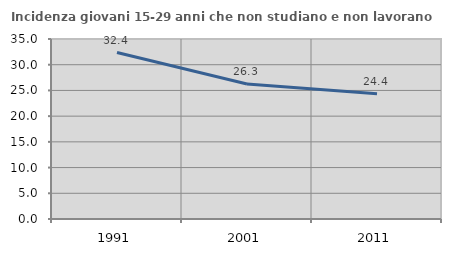
| Category | Incidenza giovani 15-29 anni che non studiano e non lavorano  |
|---|---|
| 1991.0 | 32.364 |
| 2001.0 | 26.257 |
| 2011.0 | 24.352 |